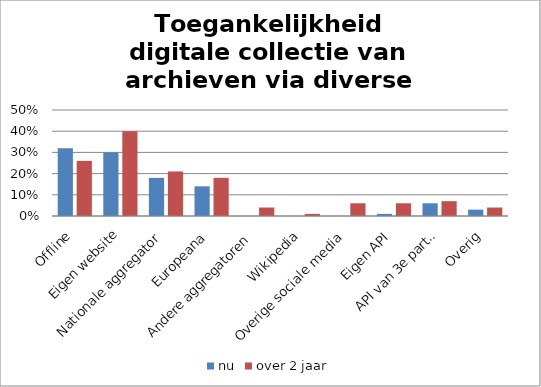
| Category | nu | over 2 jaar |
|---|---|---|
| Offline | 0.32 | 0.26 |
| Eigen website | 0.3 | 0.4 |
| Nationale aggregator | 0.18 | 0.21 |
| Europeana | 0.14 | 0.18 |
| Andere aggregatoren | 0 | 0.04 |
| Wikipedia | 0 | 0.01 |
| Overige sociale media | 0 | 0.06 |
| Eigen API | 0.01 | 0.06 |
| API van 3e partij | 0.06 | 0.07 |
| Overig | 0.03 | 0.04 |